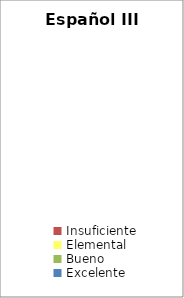
| Category | Español III |
|---|---|
| Insuficiente | 0 |
| Elemental | 0 |
| Bueno | 0 |
| Excelente | 0 |